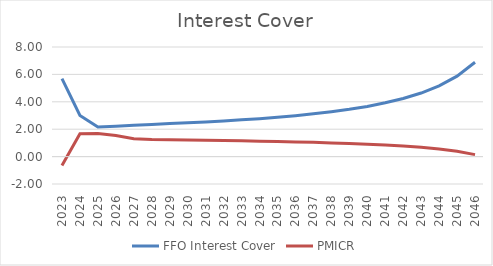
| Category | FFO Interest Cover | PMICR |
|---|---|---|
| 2023.0 | 5.692 | -0.651 |
| 2024.0 | 3.004 | 1.667 |
| 2025.0 | 2.158 | 1.689 |
| 2026.0 | 2.213 | 1.543 |
| 2027.0 | 2.28 | 1.308 |
| 2028.0 | 2.349 | 1.249 |
| 2029.0 | 2.408 | 1.231 |
| 2030.0 | 2.466 | 1.212 |
| 2031.0 | 2.532 | 1.193 |
| 2032.0 | 2.603 | 1.173 |
| 2033.0 | 2.682 | 1.151 |
| 2034.0 | 2.77 | 1.128 |
| 2035.0 | 2.871 | 1.102 |
| 2036.0 | 2.987 | 1.072 |
| 2037.0 | 3.121 | 1.038 |
| 2038.0 | 3.275 | 1.001 |
| 2039.0 | 3.452 | 0.958 |
| 2040.0 | 3.664 | 0.907 |
| 2041.0 | 3.925 | 0.844 |
| 2042.0 | 4.24 | 0.77 |
| 2043.0 | 4.64 | 0.676 |
| 2044.0 | 5.164 | 0.552 |
| 2045.0 | 5.874 | 0.385 |
| 2046.0 | 6.891 | 0.145 |